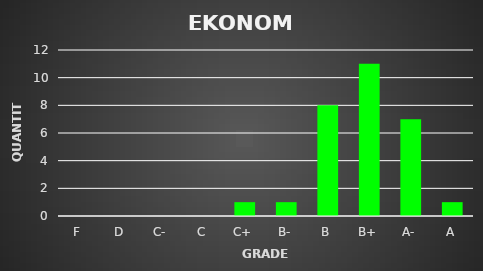
| Category | Series 0 |
|---|---|
| F | 0 |
| D | 0 |
| C- | 0 |
| C | 0 |
| C+ | 1 |
| B- | 1 |
| B | 8 |
| B+ | 11 |
| A- | 7 |
| A | 1 |